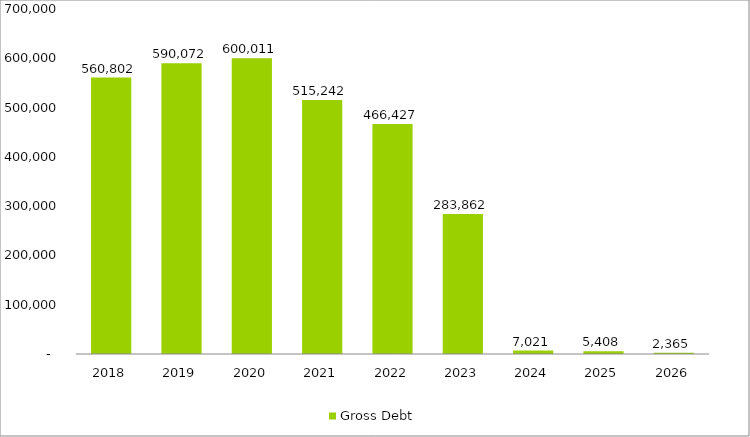
| Category | Gross Debt |
|---|---|
| 2018 | 560802.271 |
| 2019 | 590071.67 |
| 2020 | 600011.202 |
| 2021 | 515242.307 |
| 2022 | 466426.796 |
| 2023 | 283861.601 |
| 2024 | 7021.369 |
| 2025 | 5407.91 |
| 2026 | 2364.721 |